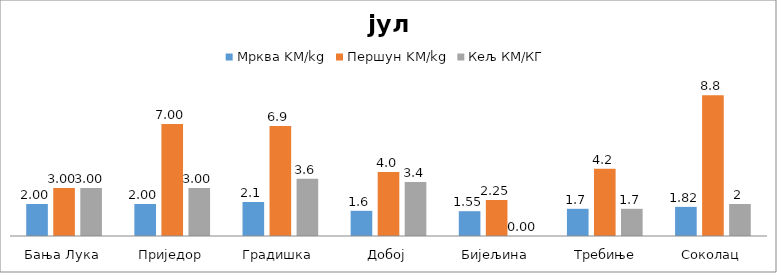
| Category | Мрква KM/kg | Першун KM/kg | Кељ КМ/КГ |
|---|---|---|---|
| Бања Лука | 2 | 3 | 3 |
| Приједор | 2 | 7 | 3 |
| Градишка | 2.125 | 6.875 | 3.575 |
| Добој | 1.575 | 4 | 3.375 |
| Бијељина | 1.55 | 2.25 | 0 |
|  Требиње | 1.7 | 4.2 | 1.7 |
| Соколац | 1.82 | 8.8 | 2 |